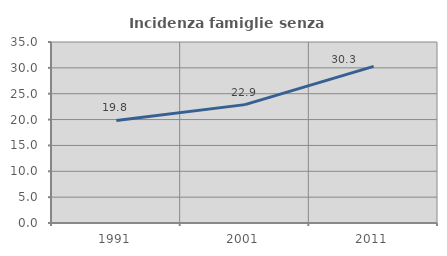
| Category | Incidenza famiglie senza nuclei |
|---|---|
| 1991.0 | 19.841 |
| 2001.0 | 22.891 |
| 2011.0 | 30.297 |